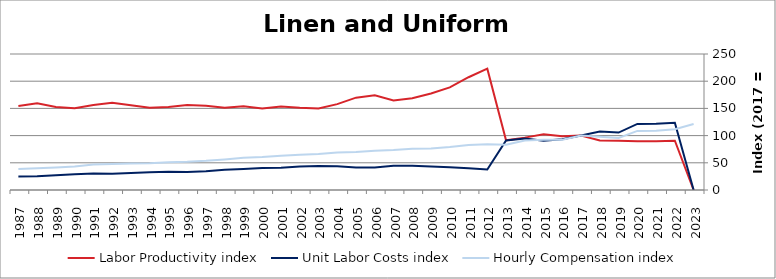
| Category | Labor Productivity index | Unit Labor Costs index | Hourly Compensation index |
|---|---|---|---|
| 2023.0 | 0 | 0 | 121.348 |
| 2022.0 | 90.505 | 123.466 | 111.742 |
| 2021.0 | 89.464 | 121.713 | 108.889 |
| 2020.0 | 89.439 | 121.433 | 108.609 |
| 2019.0 | 90.645 | 105.499 | 95.629 |
| 2018.0 | 91.205 | 107.457 | 98.006 |
| 2017.0 | 100 | 100 | 100 |
| 2016.0 | 98.999 | 93.308 | 92.374 |
| 2015.0 | 102.267 | 90.496 | 92.547 |
| 2014.0 | 96.283 | 94.679 | 91.16 |
| 2013.0 | 91.432 | 91.2 | 83.386 |
| 2012.0 | 223.09 | 37.798 | 84.324 |
| 2011.0 | 207.321 | 39.831 | 82.578 |
| 2010.0 | 188.734 | 41.796 | 78.884 |
| 2009.0 | 177.284 | 43.076 | 76.367 |
| 2008.0 | 168.816 | 44.803 | 75.634 |
| 2007.0 | 164.631 | 44.652 | 73.511 |
| 2006.0 | 173.933 | 41.489 | 72.163 |
| 2005.0 | 169.745 | 41.26 | 70.036 |
| 2004.0 | 157.817 | 43.703 | 68.97 |
| 2003.0 | 149.901 | 44.025 | 65.994 |
| 2002.0 | 151.129 | 42.995 | 64.978 |
| 2001.0 | 153.481 | 41.017 | 62.954 |
| 2000.0 | 149.994 | 40.407 | 60.608 |
| 1999.0 | 153.955 | 38.53 | 59.319 |
| 1998.0 | 151.392 | 37.097 | 56.162 |
| 1997.0 | 155.045 | 34.548 | 53.564 |
| 1996.0 | 156.198 | 33.207 | 51.869 |
| 1995.0 | 152.641 | 33.49 | 51.119 |
| 1994.0 | 151.006 | 32.495 | 49.069 |
| 1993.0 | 155.97 | 31.237 | 48.721 |
| 1992.0 | 160.369 | 29.84 | 47.854 |
| 1991.0 | 156.275 | 30.12 | 47.071 |
| 1990.0 | 150.406 | 28.828 | 43.36 |
| 1989.0 | 152.703 | 27.093 | 41.372 |
| 1988.0 | 159.413 | 25.125 | 40.052 |
| 1987.0 | 154.33 | 24.956 | 38.514 |